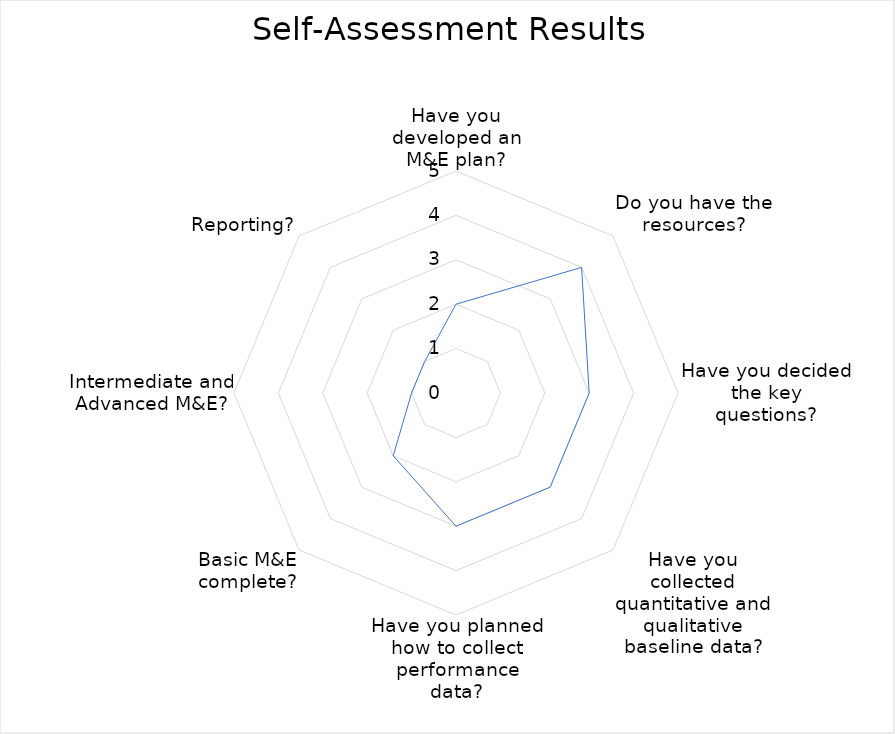
| Category | Series 0 |
|---|---|
| Have you developed an M&E plan? | 2 |
| Do you have the resources? | 4 |
| Have you decided the key questions? | 3 |
| Have you collected quantitative and qualitative baseline data? | 3 |
| Have you planned how to collect performance data? | 3 |
| Basic M&E complete? | 2 |
| Intermediate and Advanced M&E? | 1 |
| Reporting? | 1 |